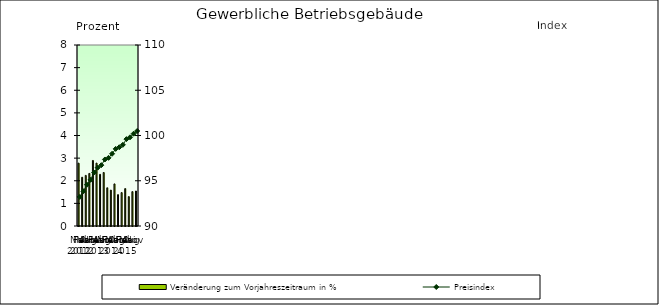
| Category | Veränderung zum Vorjahreszeitraum in % |
|---|---|
| 0 | 2.778 |
| 1 | 2.155 |
| 2 | 2.237 |
| 3 | 2.323 |
| 4 | 2.896 |
| 5 | 2.78 |
| 6 | 2.284 |
| 7 | 2.365 |
| 8 | 1.689 |
| 9 | 1.586 |
| 10 | 1.86 |
| 11 | 1.386 |
| 12 | 1.476 |
| 13 | 1.653 |
| 14 | 1.299 |
| 15 | 1.519 |
| 16 | 1.546 |